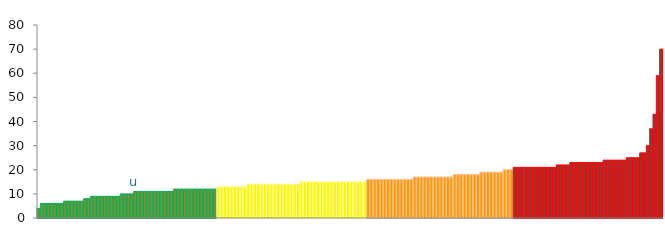
| Category | Top Quartile | 2nd Quartile | 3rd Quartile | Bottom Quartile | Series 4 |
|---|---|---|---|---|---|
|  | 4 | 0 | 0 | 0 | 4 |
|  | 6 | 0 | 0 | 0 | 6 |
|  | 6 | 0 | 0 | 0 | 6 |
|  | 6 | 0 | 0 | 0 | 6 |
|  | 6 | 0 | 0 | 0 | 6 |
|  | 6 | 0 | 0 | 0 | 6 |
|  | 6 | 0 | 0 | 0 | 6 |
|  | 6 | 0 | 0 | 0 | 6 |
|  | 7 | 0 | 0 | 0 | 7 |
|  | 7 | 0 | 0 | 0 | 7 |
|  | 7 | 0 | 0 | 0 | 7 |
|  | 7 | 0 | 0 | 0 | 7 |
|  | 7 | 0 | 0 | 0 | 7 |
|  | 7 | 0 | 0 | 0 | 7 |
|  | 8 | 0 | 0 | 0 | 8 |
|  | 8 | 0 | 0 | 0 | 8 |
|  | 9 | 0 | 0 | 0 | 9 |
|  | 9 | 0 | 0 | 0 | 9 |
|  | 9 | 0 | 0 | 0 | 9 |
|  | 9 | 0 | 0 | 0 | 9 |
|  | 9 | 0 | 0 | 0 | 9 |
|  | 9 | 0 | 0 | 0 | 9 |
|  | 9 | 0 | 0 | 0 | 9 |
|  | 9 | 0 | 0 | 0 | 9 |
|  | 9 | 0 | 0 | 0 | 9 |
|  | 10 | 0 | 0 | 0 | 10 |
|  | 10 | 0 | 0 | 0 | 10 |
|  | 10 | 0 | 0 | 0 | 10 |
|  | 10 | 0 | 0 | 0 | 10 |
| u | 11 | 0 | 0 | 0 | 11 |